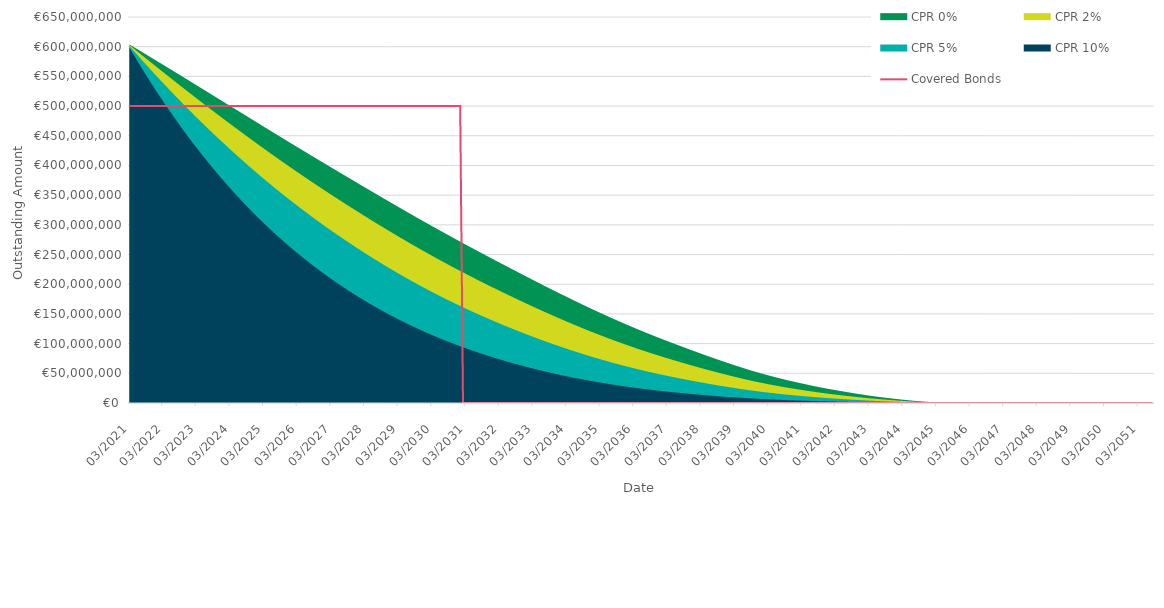
| Category | Covered Bonds |
|---|---|
| 2021-03-31 | 500000000 |
| 2021-04-30 | 500000000 |
| 2021-05-31 | 500000000 |
| 2021-06-30 | 500000000 |
| 2021-07-31 | 500000000 |
| 2021-08-31 | 500000000 |
| 2021-09-30 | 500000000 |
| 2021-10-31 | 500000000 |
| 2021-11-30 | 500000000 |
| 2021-12-31 | 500000000 |
| 2022-01-31 | 500000000 |
| 2022-02-28 | 500000000 |
| 2022-03-31 | 500000000 |
| 2022-04-30 | 500000000 |
| 2022-05-31 | 500000000 |
| 2022-06-30 | 500000000 |
| 2022-07-31 | 500000000 |
| 2022-08-31 | 500000000 |
| 2022-09-30 | 500000000 |
| 2022-10-31 | 500000000 |
| 2022-11-30 | 500000000 |
| 2022-12-31 | 500000000 |
| 2023-01-31 | 500000000 |
| 2023-02-28 | 500000000 |
| 2023-03-31 | 500000000 |
| 2023-04-30 | 500000000 |
| 2023-05-31 | 500000000 |
| 2023-06-30 | 500000000 |
| 2023-07-31 | 500000000 |
| 2023-08-31 | 500000000 |
| 2023-09-30 | 500000000 |
| 2023-10-31 | 500000000 |
| 2023-11-30 | 500000000 |
| 2023-12-31 | 500000000 |
| 2024-01-31 | 500000000 |
| 2024-02-29 | 500000000 |
| 2024-03-31 | 500000000 |
| 2024-04-30 | 500000000 |
| 2024-05-31 | 500000000 |
| 2024-06-30 | 500000000 |
| 2024-07-31 | 500000000 |
| 2024-08-31 | 500000000 |
| 2024-09-30 | 500000000 |
| 2024-10-31 | 500000000 |
| 2024-11-30 | 500000000 |
| 2024-12-31 | 500000000 |
| 2025-01-31 | 500000000 |
| 2025-02-28 | 500000000 |
| 2025-03-31 | 500000000 |
| 2025-04-30 | 500000000 |
| 2025-05-31 | 500000000 |
| 2025-06-30 | 500000000 |
| 2025-07-31 | 500000000 |
| 2025-08-31 | 500000000 |
| 2025-09-30 | 500000000 |
| 2025-10-31 | 500000000 |
| 2025-11-30 | 500000000 |
| 2025-12-31 | 500000000 |
| 2026-01-31 | 500000000 |
| 2026-02-28 | 500000000 |
| 2026-03-31 | 500000000 |
| 2026-04-30 | 500000000 |
| 2026-05-31 | 500000000 |
| 2026-06-30 | 500000000 |
| 2026-07-31 | 500000000 |
| 2026-08-31 | 500000000 |
| 2026-09-30 | 500000000 |
| 2026-10-31 | 500000000 |
| 2026-11-30 | 500000000 |
| 2026-12-31 | 500000000 |
| 2027-01-31 | 500000000 |
| 2027-02-28 | 500000000 |
| 2027-03-31 | 500000000 |
| 2027-04-30 | 500000000 |
| 2027-05-31 | 500000000 |
| 2027-06-30 | 500000000 |
| 2027-07-31 | 500000000 |
| 2027-08-31 | 500000000 |
| 2027-09-30 | 500000000 |
| 2027-10-31 | 500000000 |
| 2027-11-30 | 500000000 |
| 2027-12-31 | 500000000 |
| 2028-01-31 | 500000000 |
| 2028-02-29 | 500000000 |
| 2028-03-31 | 500000000 |
| 2028-04-30 | 500000000 |
| 2028-05-31 | 500000000 |
| 2028-06-30 | 500000000 |
| 2028-07-31 | 500000000 |
| 2028-08-31 | 500000000 |
| 2028-09-30 | 500000000 |
| 2028-10-31 | 500000000 |
| 2028-11-30 | 500000000 |
| 2028-12-31 | 500000000 |
| 2029-01-31 | 500000000 |
| 2029-02-28 | 500000000 |
| 2029-03-31 | 500000000 |
| 2029-04-30 | 500000000 |
| 2029-05-31 | 500000000 |
| 2029-06-30 | 500000000 |
| 2029-07-31 | 500000000 |
| 2029-08-31 | 500000000 |
| 2029-09-30 | 500000000 |
| 2029-10-31 | 500000000 |
| 2029-11-30 | 500000000 |
| 2029-12-31 | 500000000 |
| 2030-01-31 | 500000000 |
| 2030-02-28 | 500000000 |
| 2030-03-31 | 500000000 |
| 2030-04-30 | 500000000 |
| 2030-05-31 | 500000000 |
| 2030-06-30 | 500000000 |
| 2030-07-31 | 500000000 |
| 2030-08-31 | 500000000 |
| 2030-09-30 | 500000000 |
| 2030-10-31 | 500000000 |
| 2030-11-30 | 500000000 |
| 2030-12-31 | 500000000 |
| 2031-01-31 | 500000000 |
| 2031-02-28 | 0 |
| 2031-03-31 | 0 |
| 2031-04-30 | 0 |
| 2031-05-31 | 0 |
| 2031-06-30 | 0 |
| 2031-07-31 | 0 |
| 2031-08-31 | 0 |
| 2031-09-30 | 0 |
| 2031-10-31 | 0 |
| 2031-11-30 | 0 |
| 2031-12-31 | 0 |
| 2032-01-31 | 0 |
| 2032-02-29 | 0 |
| 2032-03-31 | 0 |
| 2032-04-30 | 0 |
| 2032-05-31 | 0 |
| 2032-06-30 | 0 |
| 2032-07-31 | 0 |
| 2032-08-31 | 0 |
| 2032-09-30 | 0 |
| 2032-10-31 | 0 |
| 2032-11-30 | 0 |
| 2032-12-31 | 0 |
| 2033-01-31 | 0 |
| 2033-02-28 | 0 |
| 2033-03-31 | 0 |
| 2033-04-30 | 0 |
| 2033-05-31 | 0 |
| 2033-06-30 | 0 |
| 2033-07-31 | 0 |
| 2033-08-31 | 0 |
| 2033-09-30 | 0 |
| 2033-10-31 | 0 |
| 2033-11-30 | 0 |
| 2033-12-31 | 0 |
| 2034-01-31 | 0 |
| 2034-02-28 | 0 |
| 2034-03-31 | 0 |
| 2034-04-30 | 0 |
| 2034-05-31 | 0 |
| 2034-06-30 | 0 |
| 2034-07-31 | 0 |
| 2034-08-31 | 0 |
| 2034-09-30 | 0 |
| 2034-10-31 | 0 |
| 2034-11-30 | 0 |
| 2034-12-31 | 0 |
| 2035-01-31 | 0 |
| 2035-02-28 | 0 |
| 2035-03-31 | 0 |
| 2035-04-30 | 0 |
| 2035-05-31 | 0 |
| 2035-06-30 | 0 |
| 2035-07-31 | 0 |
| 2035-08-31 | 0 |
| 2035-09-30 | 0 |
| 2035-10-31 | 0 |
| 2035-11-30 | 0 |
| 2035-12-31 | 0 |
| 2036-01-31 | 0 |
| 2036-02-29 | 0 |
| 2036-03-31 | 0 |
| 2036-04-30 | 0 |
| 2036-05-31 | 0 |
| 2036-06-30 | 0 |
| 2036-07-31 | 0 |
| 2036-08-31 | 0 |
| 2036-09-30 | 0 |
| 2036-10-31 | 0 |
| 2036-11-30 | 0 |
| 2036-12-31 | 0 |
| 2037-01-31 | 0 |
| 2037-02-28 | 0 |
| 2037-03-31 | 0 |
| 2037-04-30 | 0 |
| 2037-05-31 | 0 |
| 2037-06-30 | 0 |
| 2037-07-31 | 0 |
| 2037-08-31 | 0 |
| 2037-09-30 | 0 |
| 2037-10-31 | 0 |
| 2037-11-30 | 0 |
| 2037-12-31 | 0 |
| 2038-01-31 | 0 |
| 2038-02-28 | 0 |
| 2038-03-31 | 0 |
| 2038-04-30 | 0 |
| 2038-05-31 | 0 |
| 2038-06-30 | 0 |
| 2038-07-31 | 0 |
| 2038-08-31 | 0 |
| 2038-09-30 | 0 |
| 2038-10-31 | 0 |
| 2038-11-30 | 0 |
| 2038-12-31 | 0 |
| 2039-01-31 | 0 |
| 2039-02-28 | 0 |
| 2039-03-31 | 0 |
| 2039-04-30 | 0 |
| 2039-05-31 | 0 |
| 2039-06-30 | 0 |
| 2039-07-31 | 0 |
| 2039-08-31 | 0 |
| 2039-09-30 | 0 |
| 2039-10-31 | 0 |
| 2039-11-30 | 0 |
| 2039-12-31 | 0 |
| 2040-01-31 | 0 |
| 2040-02-29 | 0 |
| 2040-03-31 | 0 |
| 2040-04-30 | 0 |
| 2040-05-31 | 0 |
| 2040-06-30 | 0 |
| 2040-07-31 | 0 |
| 2040-08-31 | 0 |
| 2040-09-30 | 0 |
| 2040-10-31 | 0 |
| 2040-11-30 | 0 |
| 2040-12-31 | 0 |
| 2041-01-31 | 0 |
| 2041-02-28 | 0 |
| 2041-03-31 | 0 |
| 2041-04-30 | 0 |
| 2041-05-31 | 0 |
| 2041-06-30 | 0 |
| 2041-07-31 | 0 |
| 2041-08-31 | 0 |
| 2041-09-30 | 0 |
| 2041-10-31 | 0 |
| 2041-11-30 | 0 |
| 2041-12-31 | 0 |
| 2042-01-31 | 0 |
| 2042-02-28 | 0 |
| 2042-03-31 | 0 |
| 2042-04-30 | 0 |
| 2042-05-31 | 0 |
| 2042-06-30 | 0 |
| 2042-07-31 | 0 |
| 2042-08-31 | 0 |
| 2042-09-30 | 0 |
| 2042-10-31 | 0 |
| 2042-11-30 | 0 |
| 2042-12-31 | 0 |
| 2043-01-31 | 0 |
| 2043-02-28 | 0 |
| 2043-03-31 | 0 |
| 2043-04-30 | 0 |
| 2043-05-31 | 0 |
| 2043-06-30 | 0 |
| 2043-07-31 | 0 |
| 2043-08-31 | 0 |
| 2043-09-30 | 0 |
| 2043-10-31 | 0 |
| 2043-11-30 | 0 |
| 2043-12-31 | 0 |
| 2044-01-31 | 0 |
| 2044-02-29 | 0 |
| 2044-03-31 | 0 |
| 2044-04-30 | 0 |
| 2044-05-31 | 0 |
| 2044-06-30 | 0 |
| 2044-07-31 | 0 |
| 2044-08-31 | 0 |
| 2044-09-30 | 0 |
| 2044-10-31 | 0 |
| 2044-11-30 | 0 |
| 2044-12-31 | 0 |
| 2045-01-31 | 0 |
| 2045-02-28 | 0 |
| 2045-03-31 | 0 |
| 2045-04-30 | 0 |
| 2045-05-31 | 0 |
| 2045-06-30 | 0 |
| 2045-07-31 | 0 |
| 2045-08-31 | 0 |
| 2045-09-30 | 0 |
| 2045-10-31 | 0 |
| 2045-11-30 | 0 |
| 2045-12-31 | 0 |
| 2046-01-31 | 0 |
| 2046-02-28 | 0 |
| 2046-03-31 | 0 |
| 2046-04-30 | 0 |
| 2046-05-31 | 0 |
| 2046-06-30 | 0 |
| 2046-07-31 | 0 |
| 2046-08-31 | 0 |
| 2046-09-30 | 0 |
| 2046-10-31 | 0 |
| 2046-11-30 | 0 |
| 2046-12-31 | 0 |
| 2047-01-31 | 0 |
| 2047-02-28 | 0 |
| 2047-03-31 | 0 |
| 2047-04-30 | 0 |
| 2047-05-31 | 0 |
| 2047-06-30 | 0 |
| 2047-07-31 | 0 |
| 2047-08-31 | 0 |
| 2047-09-30 | 0 |
| 2047-10-31 | 0 |
| 2047-11-30 | 0 |
| 2047-12-31 | 0 |
| 2048-01-31 | 0 |
| 2048-02-29 | 0 |
| 2048-03-31 | 0 |
| 2048-04-30 | 0 |
| 2048-05-31 | 0 |
| 2048-06-30 | 0 |
| 2048-07-31 | 0 |
| 2048-08-31 | 0 |
| 2048-09-30 | 0 |
| 2048-10-31 | 0 |
| 2048-11-30 | 0 |
| 2048-12-31 | 0 |
| 2049-01-31 | 0 |
| 2049-02-28 | 0 |
| 2049-03-31 | 0 |
| 2049-04-30 | 0 |
| 2049-05-31 | 0 |
| 2049-06-30 | 0 |
| 2049-07-31 | 0 |
| 2049-08-31 | 0 |
| 2049-09-30 | 0 |
| 2049-10-31 | 0 |
| 2049-11-30 | 0 |
| 2049-12-31 | 0 |
| 2050-01-31 | 0 |
| 2050-02-28 | 0 |
| 2050-03-31 | 0 |
| 2050-04-30 | 0 |
| 2050-05-31 | 0 |
| 2050-06-30 | 0 |
| 2050-07-31 | 0 |
| 2050-08-31 | 0 |
| 2050-09-30 | 0 |
| 2050-10-31 | 0 |
| 2050-11-30 | 0 |
| 2050-12-31 | 0 |
| 2051-01-31 | 0 |
| 2051-02-28 | 0 |
| 2051-03-31 | 0 |
| 2051-04-30 | 0 |
| 2051-05-31 | 0 |
| 2051-06-30 | 0 |
| 2051-07-31 | 0 |
| 2051-08-31 | 0 |